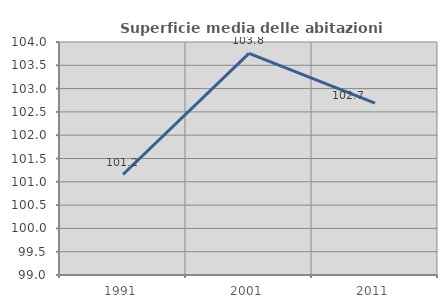
| Category | Superficie media delle abitazioni occupate |
|---|---|
| 1991.0 | 101.156 |
| 2001.0 | 103.756 |
| 2011.0 | 102.687 |